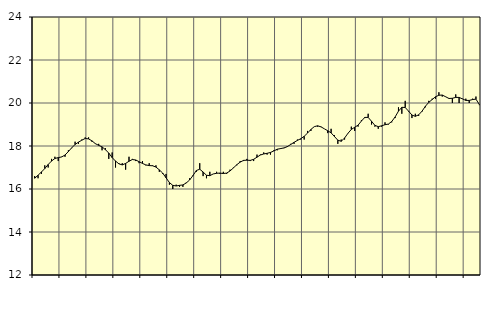
| Category | Piggar | Vård och omsorg, SNI 86-88 |
|---|---|---|
| nan | 16.6 | 16.5 |
| 87.0 | 16.5 | 16.64 |
| 87.0 | 16.7 | 16.79 |
| 87.0 | 17.1 | 16.95 |
| nan | 17 | 17.14 |
| 88.0 | 17.4 | 17.3 |
| 88.0 | 17.5 | 17.42 |
| 88.0 | 17.3 | 17.46 |
| nan | 17.5 | 17.49 |
| 89.0 | 17.5 | 17.58 |
| 89.0 | 17.8 | 17.74 |
| 89.0 | 17.9 | 17.92 |
| nan | 18.2 | 18.07 |
| 90.0 | 18.1 | 18.18 |
| 90.0 | 18.3 | 18.27 |
| 90.0 | 18.4 | 18.35 |
| nan | 18.4 | 18.33 |
| 91.0 | 18.2 | 18.24 |
| 91.0 | 18.1 | 18.11 |
| 91.0 | 18.1 | 18.03 |
| nan | 17.8 | 17.96 |
| 92.0 | 17.9 | 17.83 |
| 92.0 | 17.4 | 17.67 |
| 92.0 | 17.7 | 17.46 |
| nan | 17 | 17.3 |
| 93.0 | 17.2 | 17.17 |
| 93.0 | 17.2 | 17.12 |
| 93.0 | 16.9 | 17.19 |
| nan | 17.5 | 17.29 |
| 94.0 | 17.4 | 17.37 |
| 94.0 | 17.3 | 17.35 |
| 94.0 | 17.2 | 17.27 |
| nan | 17.3 | 17.19 |
| 95.0 | 17.1 | 17.12 |
| 95.0 | 17.2 | 17.09 |
| 95.0 | 17.1 | 17.08 |
| nan | 17.1 | 17.02 |
| 96.0 | 16.8 | 16.89 |
| 96.0 | 16.7 | 16.74 |
| 96.0 | 16.7 | 16.52 |
| nan | 16.2 | 16.3 |
| 97.0 | 16 | 16.17 |
| 97.0 | 16.2 | 16.14 |
| 97.0 | 16.1 | 16.17 |
| nan | 16.1 | 16.19 |
| 98.0 | 16.3 | 16.28 |
| 98.0 | 16.5 | 16.42 |
| 98.0 | 16.6 | 16.63 |
| nan | 16.8 | 16.86 |
| 99.0 | 17.2 | 16.92 |
| 99.0 | 16.6 | 16.79 |
| 99.0 | 16.5 | 16.64 |
| nan | 16.8 | 16.62 |
| 0.0 | 16.7 | 16.7 |
| 0.0 | 16.8 | 16.73 |
| 0.0 | 16.7 | 16.74 |
| nan | 16.8 | 16.72 |
| 1.0 | 16.7 | 16.74 |
| 1.0 | 16.9 | 16.84 |
| 1.0 | 17 | 16.98 |
| nan | 17.1 | 17.13 |
| 2.0 | 17.3 | 17.25 |
| 2.0 | 17.3 | 17.33 |
| 2.0 | 17.4 | 17.34 |
| nan | 17.3 | 17.33 |
| 3.0 | 17.3 | 17.38 |
| 3.0 | 17.6 | 17.48 |
| 3.0 | 17.6 | 17.58 |
| nan | 17.7 | 17.63 |
| 4.0 | 17.6 | 17.66 |
| 4.0 | 17.6 | 17.7 |
| 4.0 | 17.8 | 17.77 |
| nan | 17.8 | 17.85 |
| 5.0 | 17.9 | 17.88 |
| 5.0 | 17.9 | 17.91 |
| 5.0 | 18 | 17.97 |
| nan | 18.1 | 18.07 |
| 6.0 | 18.1 | 18.17 |
| 6.0 | 18.3 | 18.26 |
| 6.0 | 18.3 | 18.34 |
| nan | 18.3 | 18.45 |
| 7.0 | 18.7 | 18.6 |
| 7.0 | 18.7 | 18.77 |
| 7.0 | 18.9 | 18.9 |
| nan | 18.9 | 18.94 |
| 8.0 | 18.9 | 18.89 |
| 8.0 | 18.8 | 18.8 |
| 8.0 | 18.6 | 18.71 |
| nan | 18.8 | 18.61 |
| 9.0 | 18.5 | 18.44 |
| 9.0 | 18.1 | 18.27 |
| 9.0 | 18.3 | 18.22 |
| nan | 18.3 | 18.37 |
| 10.0 | 18.6 | 18.59 |
| 10.0 | 18.9 | 18.77 |
| 10.0 | 18.7 | 18.87 |
| nan | 18.9 | 18.97 |
| 11.0 | 19.2 | 19.16 |
| 11.0 | 19.3 | 19.33 |
| 11.0 | 19.5 | 19.33 |
| nan | 19 | 19.15 |
| 12.0 | 18.9 | 18.96 |
| 12.0 | 18.8 | 18.9 |
| 12.0 | 18.9 | 18.94 |
| nan | 19.1 | 18.99 |
| 13.0 | 19 | 19.02 |
| 13.0 | 19.1 | 19.14 |
| 13.0 | 19.3 | 19.35 |
| nan | 19.8 | 19.62 |
| 14.0 | 19.5 | 19.8 |
| 14.0 | 20.1 | 19.79 |
| 14.0 | 19.6 | 19.62 |
| nan | 19.3 | 19.44 |
| 15.0 | 19.5 | 19.38 |
| 15.0 | 19.4 | 19.45 |
| 15.0 | 19.6 | 19.62 |
| nan | 19.8 | 19.85 |
| 16.0 | 20.1 | 20.03 |
| 16.0 | 20.2 | 20.16 |
| 16.0 | 20.2 | 20.29 |
| nan | 20.5 | 20.36 |
| 17.0 | 20.3 | 20.37 |
| 17.0 | 20.3 | 20.29 |
| 17.0 | 20.2 | 20.21 |
| nan | 20 | 20.22 |
| 18.0 | 20.4 | 20.26 |
| 18.0 | 20 | 20.26 |
| 18.0 | 20.2 | 20.19 |
| nan | 20.2 | 20.12 |
| 19.0 | 20 | 20.12 |
| 19.0 | 20.2 | 20.16 |
| 19.0 | 20.3 | 20.18 |
| nan | 19.9 | 19.93 |